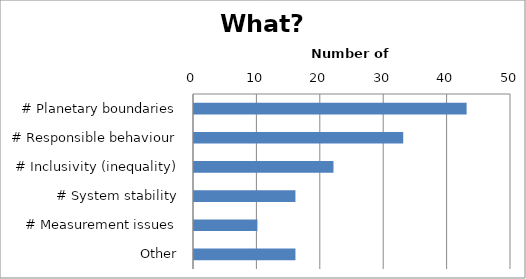
| Category | Series 0 |
|---|---|
| # Planetary boundaries | 43 |
| # Responsible behaviour | 33 |
| # Inclusivity (inequality) | 22 |
| # System stability | 16 |
| # Measurement issues | 10 |
| Other | 16 |